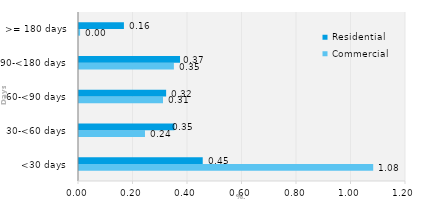
| Category | Commercial | Residential |
|---|---|---|
| <30 days | 1.08 | 0.454 |
| 30-<60 days | 0.242 | 0.35 |
| 60-<90 days | 0.308 | 0.32 |
| 90-<180 days | 0.348 | 0.371 |
| >= 180 days | 0.004 | 0.165 |